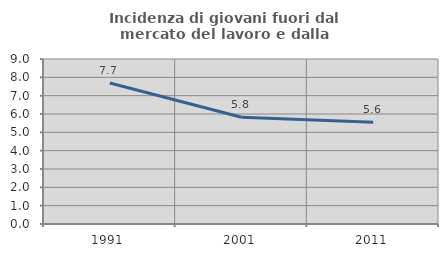
| Category | Incidenza di giovani fuori dal mercato del lavoro e dalla formazione  |
|---|---|
| 1991.0 | 7.692 |
| 2001.0 | 5.825 |
| 2011.0 | 5.556 |